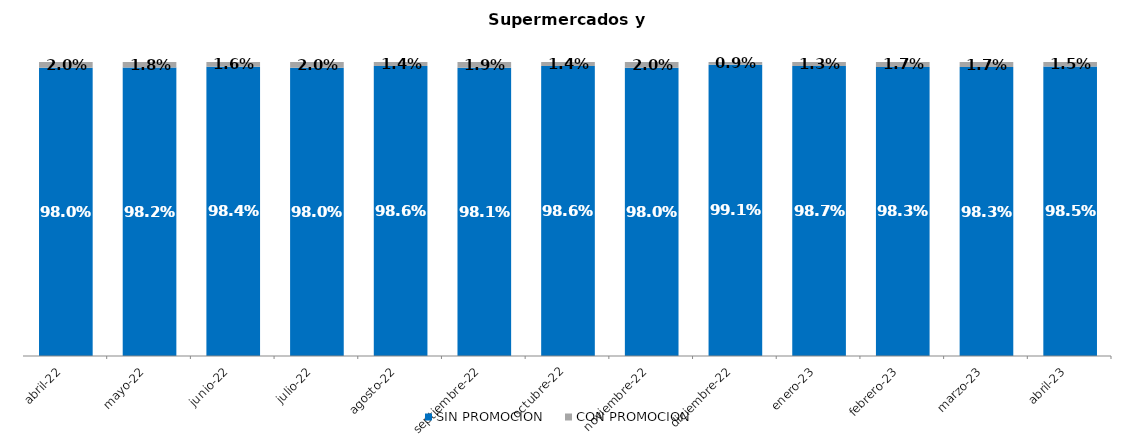
| Category | SIN PROMOCION   | CON PROMOCION   |
|---|---|---|
| 2022-04-01 | 0.98 | 0.02 |
| 2022-05-01 | 0.982 | 0.018 |
| 2022-06-01 | 0.984 | 0.016 |
| 2022-07-01 | 0.98 | 0.02 |
| 2022-08-01 | 0.986 | 0.014 |
| 2022-09-01 | 0.981 | 0.019 |
| 2022-10-01 | 0.986 | 0.014 |
| 2022-11-01 | 0.98 | 0.02 |
| 2022-12-01 | 0.991 | 0.009 |
| 2023-01-01 | 0.987 | 0.013 |
| 2023-02-01 | 0.983 | 0.017 |
| 2023-03-01 | 0.983 | 0.017 |
| 2023-04-01 | 0.985 | 0.015 |